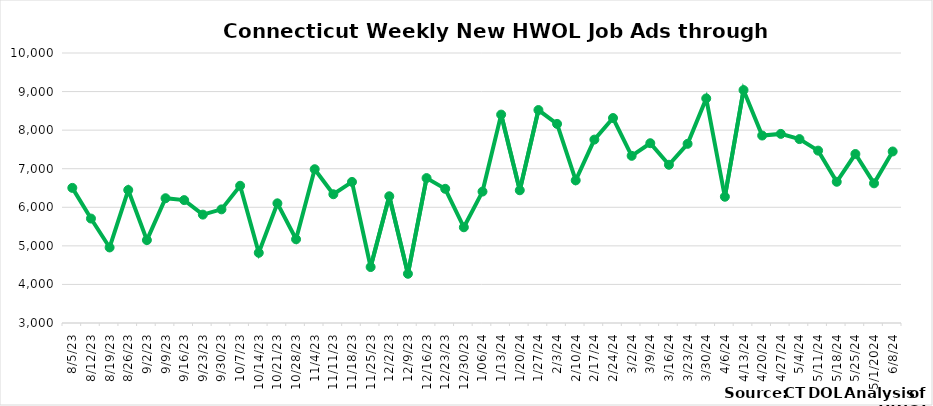
| Category | Connecticut |
|---|---|
| 8/5/23 | 6503 |
| 8/12/23 | 5708 |
| 8/19/23 | 4958 |
| 8/26/23 | 6447 |
| 9/2/23 | 5149 |
| 9/9/23 | 6235 |
| 9/16/23 | 6186 |
| 9/23/23 | 5810 |
| 9/30/23 | 5946 |
| 10/7/23 | 6558 |
| 10/14/23 | 4820 |
| 10/21/23 | 6103 |
| 10/28/23 | 5171 |
| 11/4/23 | 6987 |
| 11/11/23 | 6338 |
| 11/18/23 | 6658 |
| 11/25/23 | 4451 |
| 12/2/23 | 6286 |
| 12/9/23 | 4276 |
| 12/16/23 | 6757 |
|  12/23/23 | 6479 |
|  12/30/23 | 5482 |
|  1/06/24 | 6407 |
|  1/13/24 | 8403 |
|  1/20/24 | 6441 |
|  1/27/24 | 8521 |
|  2/3/24 | 8162 |
|  2/10/24 | 6698 |
|  2/17/24 | 7755 |
|  2/24/24 | 8314 |
|  3/2/24 | 7334 |
|  3/9/24 | 7661 |
|  3/16/24 | 7102 |
|  3/23/24 | 7645 |
|  3/30/24 | 8822 |
|  4/6/24 | 6273 |
|  4/13/24 | 9039 |
|  4/20/24 | 7860 |
|  4/27/24 | 7903 |
|  5/4/24 | 7768 |
|  5/11/24 | 7469 |
|  5/18/24 | 6661 |
|  5/25/24 | 7381 |
| 5/1/2024 | 6621 |
|  6/8/24 | 7447 |